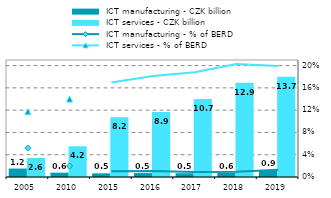
| Category |  ICT manufacturing - CZK billion |  ICT services - CZK billion |
|---|---|---|
| 2005.0 | 1.156 | 2.602 |
| 2010.0 | 0.592 | 4.198 |
| 2015.0 | 0.5 | 8.162 |
| 2016.0 | 0.532 | 8.889 |
| 2017.0 | 0.512 | 10.677 |
| 2018.0 | 0.591 | 12.903 |
| 2019.0 | 0.902 | 13.698 |